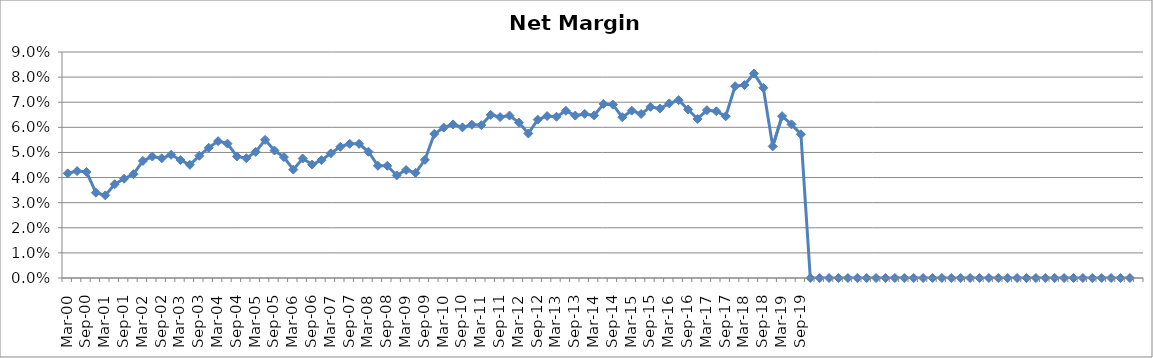
| Category | Series 0 |
|---|---|
| Mar-00 | 0.042 |
| Jun-00 | 0.043 |
| Sep-00 | 0.042 |
| Dec-00 | 0.034 |
| Mar-01 | 0.033 |
| Jun-01 | 0.037 |
| Sep-01 | 0.04 |
| Dec-01 | 0.041 |
| Mar-02 | 0.047 |
| Jun-02 | 0.048 |
| Sep-02 | 0.048 |
| Dec-02 | 0.049 |
| Mar-03 | 0.047 |
| Jun-03 | 0.045 |
| Sep-03 | 0.049 |
| Dec-03 | 0.052 |
| Mar-04 | 0.055 |
| Jun-04 | 0.053 |
| Sep-04 | 0.048 |
| Dec-04 | 0.048 |
| Mar-05 | 0.05 |
| Jun-05 | 0.055 |
| Sep-05 | 0.051 |
| Dec-05 | 0.048 |
| Mar-06 | 0.043 |
| Jun-06 | 0.048 |
| Sep-06 | 0.045 |
| Dec-06 | 0.047 |
| Mar-07 | 0.05 |
| Jun-07 | 0.052 |
| Sep-07 | 0.053 |
| Dec-07 | 0.053 |
| Mar-08 | 0.05 |
| Jun-08 | 0.045 |
| Sep-08 | 0.045 |
| Dec-08 | 0.041 |
| Mar-09 | 0.043 |
| Jun-09 | 0.042 |
| Sep-09 | 0.047 |
| Dec-09 | 0.057 |
| Mar-10 | 0.06 |
| Jun-10 | 0.061 |
| Sep-10 | 0.06 |
| Dec-10 | 0.061 |
| Mar-11 | 0.061 |
| Jun-11 | 0.065 |
| Sep-11 | 0.064 |
| Dec-11 | 0.065 |
| Mar-12 | 0.062 |
| Jun-12 | 0.058 |
| Sep-12 | 0.063 |
| Dec-12 | 0.064 |
| Mar-13 | 0.064 |
| Jun-13 | 0.067 |
| Sep-13 | 0.065 |
| Dec-13 | 0.065 |
| Mar-14 | 0.065 |
| Jun-14 | 0.069 |
| Sep-14 | 0.069 |
| Dec-14 | 0.064 |
| Mar-15 | 0.067 |
| Jun-15 | 0.065 |
| Sep-15 | 0.068 |
| Dec-15 | 0.067 |
| Mar-16 | 0.07 |
| Jun-16 | 0.071 |
| Sep-16 | 0.067 |
| Dec-16 | 0.063 |
| Mar-17 | 0.067 |
| Jun-17 | 0.066 |
| Sep-17 | 0.064 |
| Dec-17 | 0.076 |
| Mar-18 | 0.077 |
| Jun-18 | 0.081 |
| Sep-18 | 0.076 |
| Dec-18 | 0.052 |
| Mar-19 | 0.064 |
| Jun-19 | 0.061 |
| Sep-19 | 0.057 |